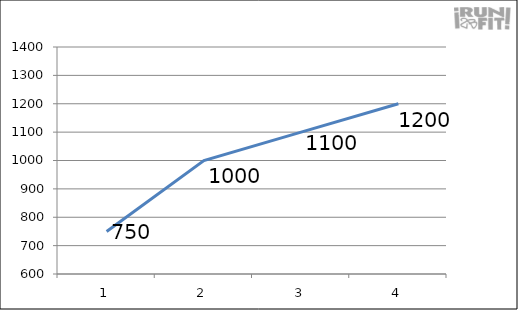
| Category | Series 0 |
|---|---|
| 0 | 750 |
| 1 | 1000 |
| 2 | 1100 |
| 3 | 1200 |